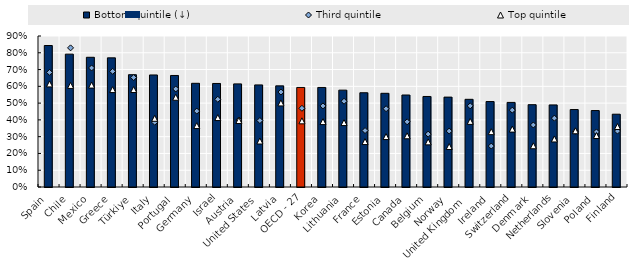
| Category | Bottom quintile (↓) |
|---|---|
| Spain | 0.843 |
| Chile | 0.792 |
| Mexico | 0.773 |
| Greece | 0.77 |
| Türkiye | 0.669 |
| Italy | 0.668 |
| Portugal | 0.665 |
| Germany | 0.618 |
| Israel | 0.617 |
| Austria | 0.615 |
| United States | 0.608 |
| Latvia | 0.603 |
| OECD - 27 | 0.593 |
| Korea | 0.593 |
| Lithuania | 0.577 |
| France | 0.562 |
| Estonia | 0.558 |
| Canada | 0.548 |
| Belgium | 0.54 |
| Norway | 0.536 |
| United Kingdom  | 0.523 |
| Ireland | 0.509 |
| Switzerland | 0.504 |
| Denmark | 0.491 |
| Netherlands | 0.489 |
| Slovenia | 0.462 |
| Poland | 0.456 |
| Finland | 0.434 |